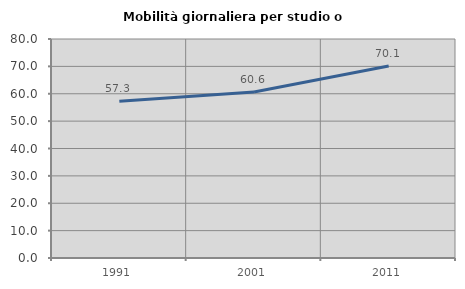
| Category | Mobilità giornaliera per studio o lavoro |
|---|---|
| 1991.0 | 57.265 |
| 2001.0 | 60.606 |
| 2011.0 | 70.147 |